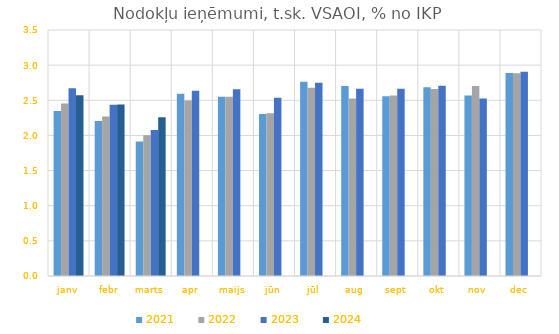
| Category | 2021 | 2022 | 2023 | 2024 |
|---|---|---|---|---|
| janv | 2.348 | 2.453 | 2.67 | 2.572 |
| febr | 2.204 | 2.269 | 2.438 | 2.438 |
| marts | 1.913 | 2.003 | 2.078 | 2.258 |
| apr | 2.592 | 2.495 | 2.637 | 0 |
| maijs | 2.55 | 2.55 | 2.656 | 0 |
| jūn | 2.305 | 2.316 | 2.536 | 0 |
| jūl | 2.765 | 2.677 | 2.748 | 0 |
| aug | 2.704 | 2.527 | 2.664 | 0 |
| sept | 2.557 | 2.567 | 2.664 | 0 |
| okt | 2.686 | 2.662 | 2.707 | 0 |
| nov | 2.568 | 2.705 | 2.526 | 0 |
| dec | 2.887 | 2.885 | 2.906 | 0 |